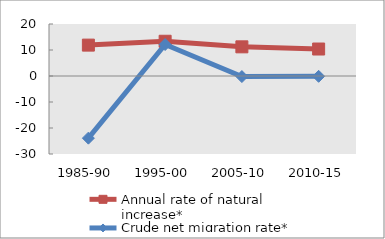
| Category | Annual rate of natural increase* | Crude net migration rate* |
|---|---|---|
| 1985-90 | 11.879 | -23.906 |
| 1995-00 | 13.365 | 12.113 |
| 2005-10 | 11.214 | -0.217 |
| 2010-15 | 10.377 | -0.125 |